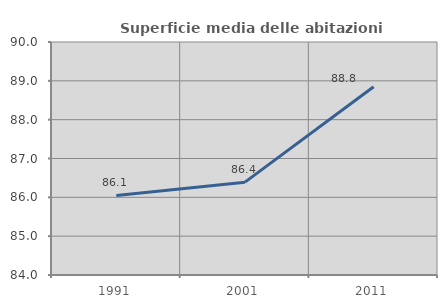
| Category | Superficie media delle abitazioni occupate |
|---|---|
| 1991.0 | 86.05 |
| 2001.0 | 86.391 |
| 2011.0 | 88.846 |